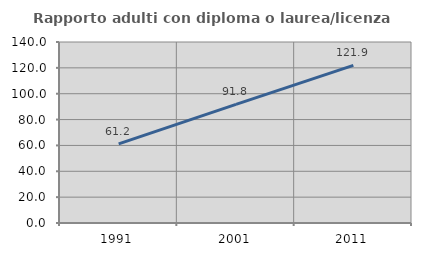
| Category | Rapporto adulti con diploma o laurea/licenza media  |
|---|---|
| 1991.0 | 61.24 |
| 2001.0 | 91.813 |
| 2011.0 | 121.875 |